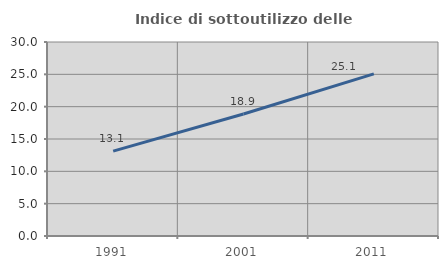
| Category | Indice di sottoutilizzo delle abitazioni  |
|---|---|
| 1991.0 | 13.123 |
| 2001.0 | 18.861 |
| 2011.0 | 25.077 |